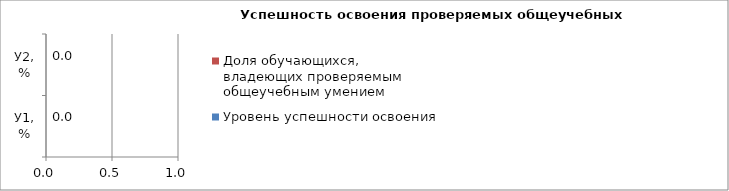
| Category | Уровень успешности освоения | Доля обучающихся, владеющих проверяемым общеучебным умением  |
|---|---|---|
| У1, % |  | 0 |
| У2, % |  | 0 |